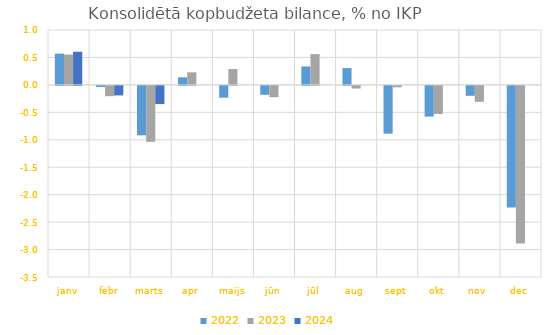
| Category | 2022 | 2023 | 2024 |
|---|---|---|---|
| janv | 0.569 | 0.553 | 0.604 |
| febr | -0.021 | -0.188 | -0.173 |
| marts | -0.901 | -1.02 | -0.332 |
| apr | 0.138 | 0.229 | 0 |
| maijs | -0.215 | 0.29 | 0 |
| jūn | -0.161 | -0.206 | 0 |
| jūl | 0.336 | 0.56 | 0 |
| aug | 0.306 | -0.048 | 0 |
| sept | -0.871 | -0.026 | 0 |
| okt | -0.56 | -0.512 | 0 |
| nov | -0.181 | -0.29 | 0 |
| dec | -2.218 | -2.869 | 0 |